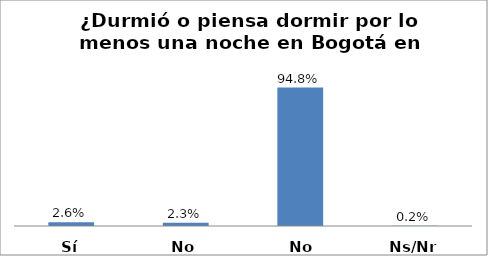
| Category | Series 0 |
|---|---|
| Sí | 0.026 |
| No | 0.023 |
| No aplica | 0.948 |
| Ns/Nr | 0.002 |